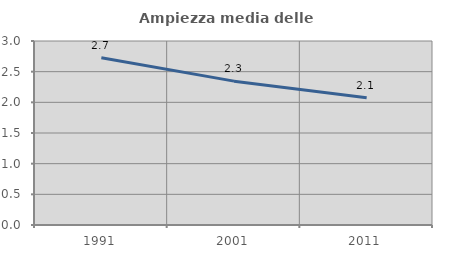
| Category | Ampiezza media delle famiglie |
|---|---|
| 1991.0 | 2.728 |
| 2001.0 | 2.346 |
| 2011.0 | 2.075 |